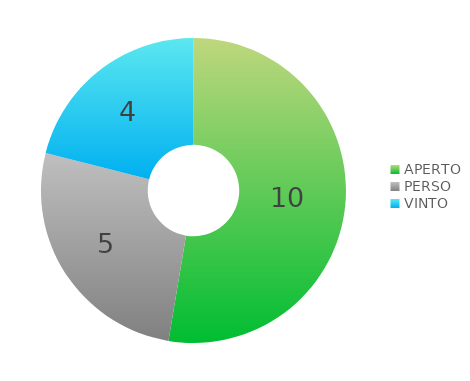
| Category | Series 0 |
|---|---|
| APERTO | 10 |
| PERSO | 5 |
| VINTO | 4 |